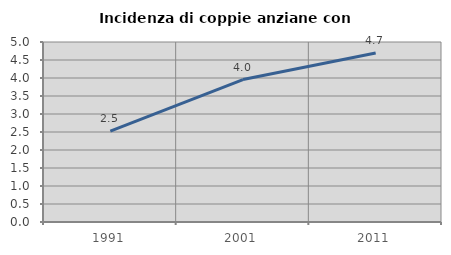
| Category | Incidenza di coppie anziane con figli |
|---|---|
| 1991.0 | 2.522 |
| 2001.0 | 3.957 |
| 2011.0 | 4.697 |